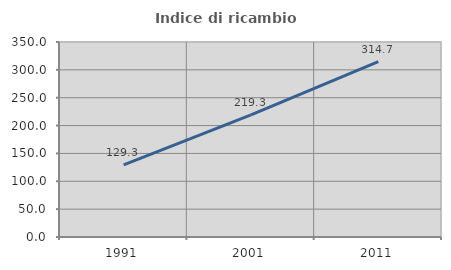
| Category | Indice di ricambio occupazionale  |
|---|---|
| 1991.0 | 129.315 |
| 2001.0 | 219.293 |
| 2011.0 | 314.749 |